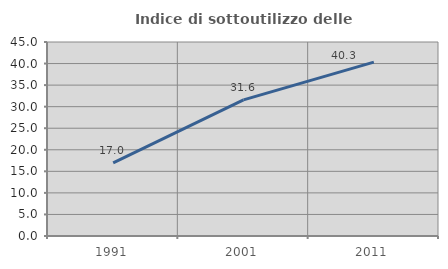
| Category | Indice di sottoutilizzo delle abitazioni  |
|---|---|
| 1991.0 | 16.957 |
| 2001.0 | 31.565 |
| 2011.0 | 40.325 |